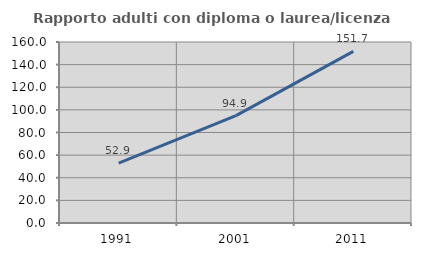
| Category | Rapporto adulti con diploma o laurea/licenza media  |
|---|---|
| 1991.0 | 52.901 |
| 2001.0 | 94.934 |
| 2011.0 | 151.717 |